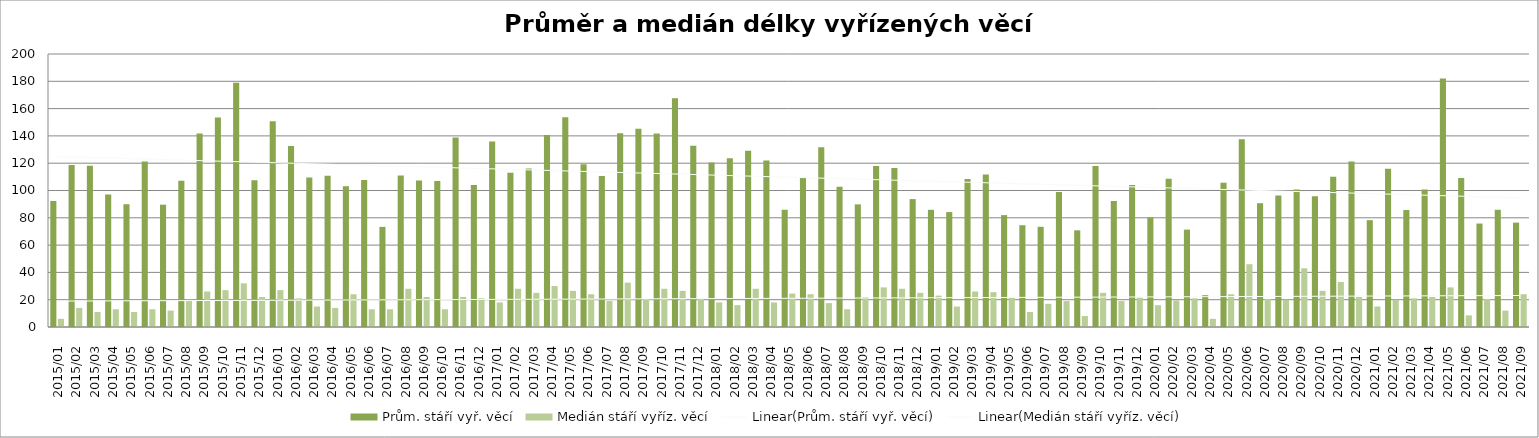
| Category | Prům. stáří vyř. věcí | Medián stáří vyříz. věcí |
|---|---|---|
| 2015/01 | 92.35 | 6 |
| 2015/02 | 118.68 | 14 |
| 2015/03 | 118.07 | 11 |
| 2015/04 | 97.11 | 13 |
| 2015/05 | 89.96 | 11 |
| 2015/06 | 121.31 | 13 |
| 2015/07 | 89.62 | 12 |
| 2015/08 | 107.18 | 20 |
| 2015/09 | 141.72 | 26 |
| 2015/10 | 153.47 | 27 |
| 2015/11 | 178.91 | 32 |
| 2015/12 | 107.44 | 22 |
| 2016/01 | 150.65 | 27 |
| 2016/02 | 132.67 | 21 |
| 2016/03 | 109.56 | 15 |
| 2016/04 | 110.75 | 14 |
| 2016/05 | 103.11 | 24 |
| 2016/06 | 107.78 | 13 |
| 2016/07 | 73.34 | 13 |
| 2016/08 | 110.92 | 28 |
| 2016/09 | 107.4 | 22 |
| 2016/10 | 106.93 | 13 |
| 2016/11 | 138.82 | 22 |
| 2016/12 | 104.05 | 21 |
| 2017/01 | 135.98 | 18 |
| 2017/02 | 112.94 | 28 |
| 2017/03 | 116.18 | 25 |
| 2017/04 | 140.62 | 30 |
| 2017/05 | 153.65 | 26.5 |
| 2017/06 | 119.28 | 24 |
| 2017/07 | 110.68 | 19 |
| 2017/08 | 141.86 | 32.5 |
| 2017/09 | 145.21 | 20.5 |
| 2017/10 | 141.74 | 28 |
| 2017/11 | 167.55 | 26.5 |
| 2017/12 | 132.82 | 21 |
| 2018/01 | 120.52 | 18 |
| 2018/02 | 123.57 | 16 |
| 2018/03 | 129.1 | 28 |
| 2018/04 | 121.94 | 18 |
| 2018/05 | 85.91 | 24.5 |
| 2018/06 | 109.38 | 24 |
| 2018/07 | 131.67 | 17.5 |
| 2018/08 | 102.71 | 13 |
| 2018/09 | 89.84 | 22 |
| 2018/10 | 118.04 | 29 |
| 2018/11 | 116.57 | 28 |
| 2018/12 | 93.71 | 25 |
| 2019/01 | 85.86 | 23 |
| 2019/02 | 84.18 | 15 |
| 2019/03 | 108.46 | 26 |
| 2019/04 | 111.69 | 25.5 |
| 2019/05 | 81.96 | 22 |
| 2019/06 | 74.56 | 11 |
| 2019/07 | 73.4 | 17 |
| 2019/08 | 98.83 | 19 |
| 2019/09 | 70.84 | 8 |
| 2019/10 | 117.93 | 25 |
| 2019/11 | 92.32 | 19 |
| 2019/12 | 103.94 | 21.5 |
| 2020/01 | 80.23 | 16 |
| 2020/02 | 108.55 | 19.5 |
| 2020/03 | 71.34 | 21 |
| 2020/04 | 23.3 | 6 |
| 2020/05 | 105.6 | 24 |
| 2020/06 | 137.57 | 46 |
| 2020/07 | 90.69 | 20.5 |
| 2020/08 | 96.28 | 20 |
| 2020/09 | 100.66 | 43 |
| 2020/10 | 95.77 | 26.5 |
| 2020/11 | 110.13 | 33 |
| 2020/12 | 121.31 | 22 |
| 2021/01 | 78.27 | 15 |
| 2021/02 | 115.9 | 20 |
| 2021/03 | 85.68 | 21 |
| 2021/04 | 100.73 | 22 |
| 2021/05 | 182.01 | 29 |
| 2021/06 | 109.1 | 8.5 |
| 2021/07 | 75.78 | 20.5 |
| 2021/08 | 85.88 | 12 |
| 2021/09 | 76.48 | 24 |